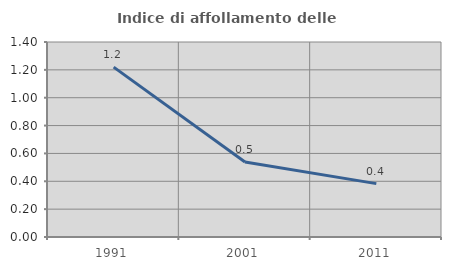
| Category | Indice di affollamento delle abitazioni  |
|---|---|
| 1991.0 | 1.22 |
| 2001.0 | 0.539 |
| 2011.0 | 0.383 |